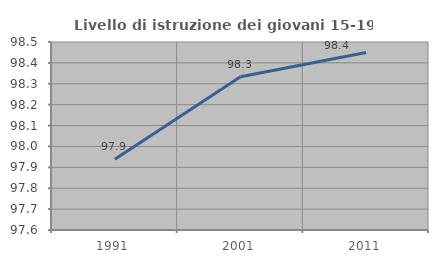
| Category | Livello di istruzione dei giovani 15-19 anni |
|---|---|
| 1991.0 | 97.938 |
| 2001.0 | 98.333 |
| 2011.0 | 98.45 |